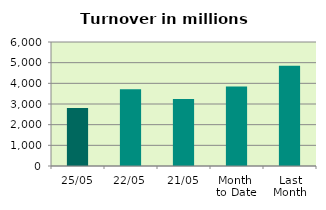
| Category | Series 0 |
|---|---|
| 25/05 | 2801.043 |
| 22/05 | 3719.715 |
| 21/05 | 3245.64 |
| Month 
to Date | 3848.023 |
| Last
Month | 4850.364 |